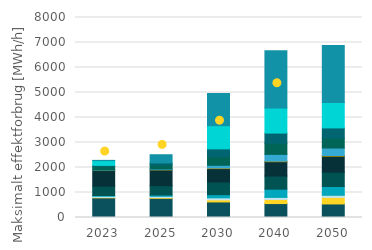
| Category | DAC | Husholdninger | Lastbiler og busser | Letbane, s-tog, metro, godstog, fjern- og regionaltog | Lufttransport | Personbiler og varebiler | Produktionserhverv | Serviceerhverv | Søtransport | Store datacentre | Individuelle varmepumper | Store varmepumper  | Elkedler | Power-to-X |
|---|---|---|---|---|---|---|---|---|---|---|---|---|---|---|
| 2023.0 | 0 | 786.11 | 19.837 | 43.237 | 0 | 32.294 | 372.651 | 624.015 | 13.469 | 7.837 | 146.498 | 38.733 | 190 | 10 |
| 2025.0 | 0 | 768.283 | 31.436 | 47.673 | 0 | 51.279 | 373.758 | 629.608 | 13.381 | 25.7 | 167.166 | 75.539 | 0 | 327 |
| 2030.0 | 0 | 622.201 | 83.57 | 86.33 | 0.482 | 122.938 | 503.719 | 536.9 | 26.172 | 106.437 | 350.881 | 305.124 | 927.3 | 1287 |
| 2040.0 | 0 | 557.526 | 164.297 | 89.822 | 4.002 | 318.218 | 523.884 | 573.892 | 24.193 | 269.449 | 447.086 | 404.289 | 1003.9 | 2287 |
| 2050.0 | 0 | 541.857 | 261.371 | 90.017 | 15.177 | 332.095 | 570.999 | 638.396 | 29.255 | 300.5 | 393.113 | 409.942 | 1014.9 | 2287 |